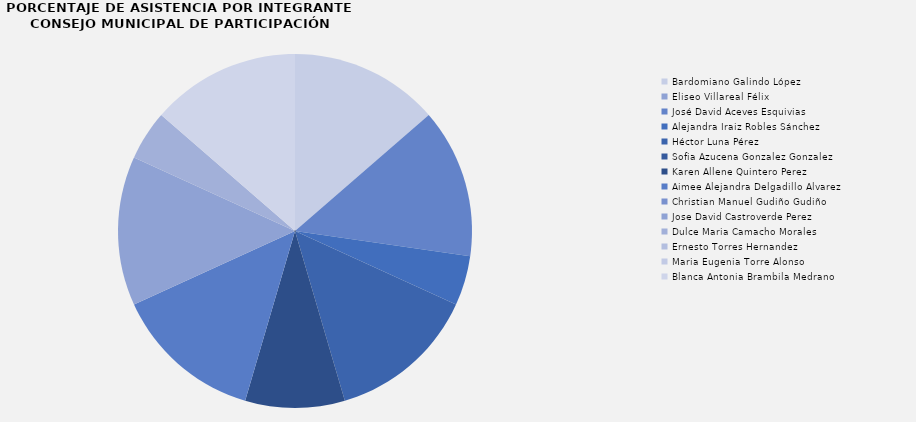
| Category | Total de asistencias |
|---|---|
| Bardomiano Galindo López | 3 |
| Eliseo Villareal Félix | 0 |
| José David Aceves Esquivias | 3 |
| Alejandra Iraiz Robles Sánchez | 1 |
| Héctor Luna Pérez | 3 |
| Sofia Azucena Gonzalez Gonzalez | 0 |
| Karen Allene Quintero Perez | 2 |
| Aimee Alejandra Delgadillo Alvarez | 3 |
| Christian Manuel Gudiño Gudiño | 0 |
| Jose David Castroverde Perez | 3 |
| Dulce Maria Camacho Morales | 1 |
| Ernesto Torres Hernandez | 0 |
| Maria Eugenia Torre Alonso | 0 |
| Blanca Antonia Brambila Medrano | 3 |